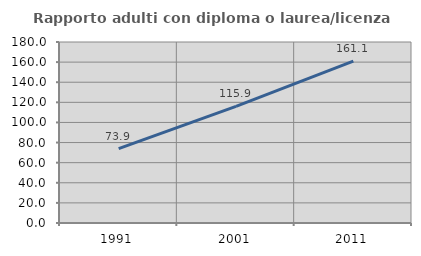
| Category | Rapporto adulti con diploma o laurea/licenza media  |
|---|---|
| 1991.0 | 73.88 |
| 2001.0 | 115.926 |
| 2011.0 | 161.067 |